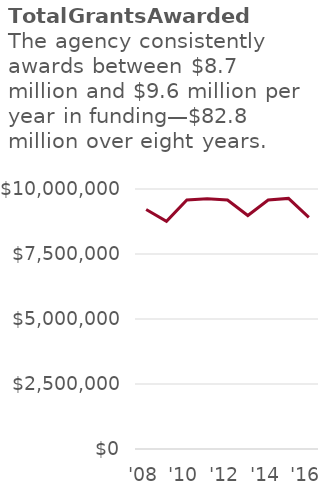
| Category | Total Grants Awarded |
|---|---|
| '08 | 9212184 |
| '09 | 8759456 |
| '10 | 9576217 |
| '11 | 9623374 |
| '12 | 9576217 |
| '13 | 8981046 |
| '14 | 9576217 |
| '15 | 9638564 |
| '16 | 8906808 |